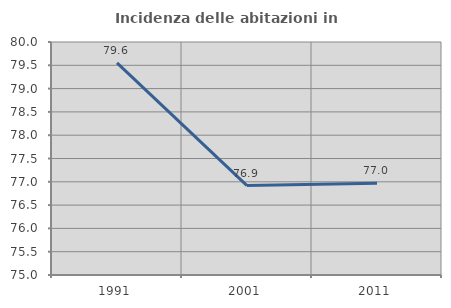
| Category | Incidenza delle abitazioni in proprietà  |
|---|---|
| 1991.0 | 79.554 |
| 2001.0 | 76.918 |
| 2011.0 | 76.971 |